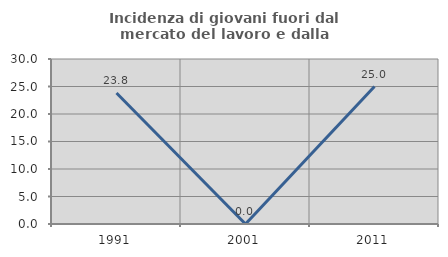
| Category | Incidenza di giovani fuori dal mercato del lavoro e dalla formazione  |
|---|---|
| 1991.0 | 23.81 |
| 2001.0 | 0 |
| 2011.0 | 25 |